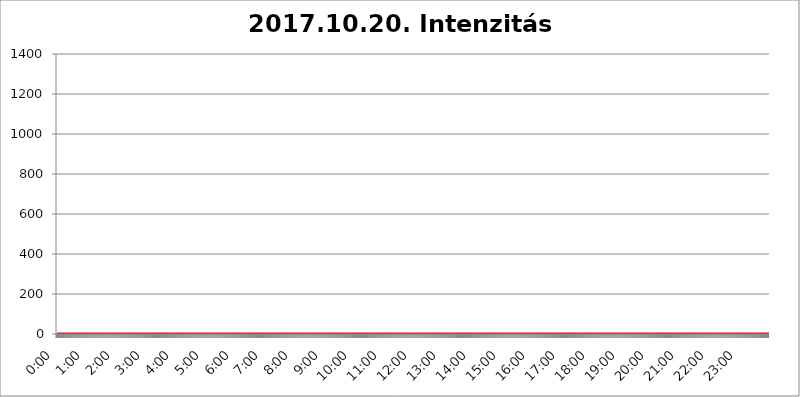
| Category | 2017.10.20. Intenzitás [W/m^2] |
|---|---|
| 0.0 | 0 |
| 0.0006944444444444445 | 0 |
| 0.001388888888888889 | 0 |
| 0.0020833333333333333 | 0 |
| 0.002777777777777778 | 0 |
| 0.003472222222222222 | 0 |
| 0.004166666666666667 | 0 |
| 0.004861111111111111 | 0 |
| 0.005555555555555556 | 0 |
| 0.0062499999999999995 | 0 |
| 0.006944444444444444 | 0 |
| 0.007638888888888889 | 0 |
| 0.008333333333333333 | 0 |
| 0.009027777777777779 | 0 |
| 0.009722222222222222 | 0 |
| 0.010416666666666666 | 0 |
| 0.011111111111111112 | 0 |
| 0.011805555555555555 | 0 |
| 0.012499999999999999 | 0 |
| 0.013194444444444444 | 0 |
| 0.013888888888888888 | 0 |
| 0.014583333333333332 | 0 |
| 0.015277777777777777 | 0 |
| 0.015972222222222224 | 0 |
| 0.016666666666666666 | 0 |
| 0.017361111111111112 | 0 |
| 0.018055555555555557 | 0 |
| 0.01875 | 0 |
| 0.019444444444444445 | 0 |
| 0.02013888888888889 | 0 |
| 0.020833333333333332 | 0 |
| 0.02152777777777778 | 0 |
| 0.022222222222222223 | 0 |
| 0.02291666666666667 | 0 |
| 0.02361111111111111 | 0 |
| 0.024305555555555556 | 0 |
| 0.024999999999999998 | 0 |
| 0.025694444444444447 | 0 |
| 0.02638888888888889 | 0 |
| 0.027083333333333334 | 0 |
| 0.027777777777777776 | 0 |
| 0.02847222222222222 | 0 |
| 0.029166666666666664 | 0 |
| 0.029861111111111113 | 0 |
| 0.030555555555555555 | 0 |
| 0.03125 | 0 |
| 0.03194444444444445 | 0 |
| 0.03263888888888889 | 0 |
| 0.03333333333333333 | 0 |
| 0.034027777777777775 | 0 |
| 0.034722222222222224 | 0 |
| 0.035416666666666666 | 0 |
| 0.036111111111111115 | 0 |
| 0.03680555555555556 | 0 |
| 0.0375 | 0 |
| 0.03819444444444444 | 0 |
| 0.03888888888888889 | 0 |
| 0.03958333333333333 | 0 |
| 0.04027777777777778 | 0 |
| 0.04097222222222222 | 0 |
| 0.041666666666666664 | 0 |
| 0.042361111111111106 | 0 |
| 0.04305555555555556 | 0 |
| 0.043750000000000004 | 0 |
| 0.044444444444444446 | 0 |
| 0.04513888888888889 | 0 |
| 0.04583333333333334 | 0 |
| 0.04652777777777778 | 0 |
| 0.04722222222222222 | 0 |
| 0.04791666666666666 | 0 |
| 0.04861111111111111 | 0 |
| 0.049305555555555554 | 0 |
| 0.049999999999999996 | 0 |
| 0.05069444444444445 | 0 |
| 0.051388888888888894 | 0 |
| 0.052083333333333336 | 0 |
| 0.05277777777777778 | 0 |
| 0.05347222222222222 | 0 |
| 0.05416666666666667 | 0 |
| 0.05486111111111111 | 0 |
| 0.05555555555555555 | 0 |
| 0.05625 | 0 |
| 0.05694444444444444 | 0 |
| 0.057638888888888885 | 0 |
| 0.05833333333333333 | 0 |
| 0.05902777777777778 | 0 |
| 0.059722222222222225 | 0 |
| 0.06041666666666667 | 0 |
| 0.061111111111111116 | 0 |
| 0.06180555555555556 | 0 |
| 0.0625 | 0 |
| 0.06319444444444444 | 0 |
| 0.06388888888888888 | 0 |
| 0.06458333333333334 | 0 |
| 0.06527777777777778 | 0 |
| 0.06597222222222222 | 0 |
| 0.06666666666666667 | 0 |
| 0.06736111111111111 | 0 |
| 0.06805555555555555 | 0 |
| 0.06874999999999999 | 0 |
| 0.06944444444444443 | 0 |
| 0.07013888888888889 | 0 |
| 0.07083333333333333 | 0 |
| 0.07152777777777779 | 0 |
| 0.07222222222222223 | 0 |
| 0.07291666666666667 | 0 |
| 0.07361111111111111 | 0 |
| 0.07430555555555556 | 0 |
| 0.075 | 0 |
| 0.07569444444444444 | 0 |
| 0.0763888888888889 | 0 |
| 0.07708333333333334 | 0 |
| 0.07777777777777778 | 0 |
| 0.07847222222222222 | 0 |
| 0.07916666666666666 | 0 |
| 0.0798611111111111 | 0 |
| 0.08055555555555556 | 0 |
| 0.08125 | 0 |
| 0.08194444444444444 | 0 |
| 0.08263888888888889 | 0 |
| 0.08333333333333333 | 0 |
| 0.08402777777777777 | 0 |
| 0.08472222222222221 | 0 |
| 0.08541666666666665 | 0 |
| 0.08611111111111112 | 0 |
| 0.08680555555555557 | 0 |
| 0.08750000000000001 | 0 |
| 0.08819444444444445 | 0 |
| 0.08888888888888889 | 0 |
| 0.08958333333333333 | 0 |
| 0.09027777777777778 | 0 |
| 0.09097222222222222 | 0 |
| 0.09166666666666667 | 0 |
| 0.09236111111111112 | 0 |
| 0.09305555555555556 | 0 |
| 0.09375 | 0 |
| 0.09444444444444444 | 0 |
| 0.09513888888888888 | 0 |
| 0.09583333333333333 | 0 |
| 0.09652777777777777 | 0 |
| 0.09722222222222222 | 0 |
| 0.09791666666666667 | 0 |
| 0.09861111111111111 | 0 |
| 0.09930555555555555 | 0 |
| 0.09999999999999999 | 0 |
| 0.10069444444444443 | 0 |
| 0.1013888888888889 | 0 |
| 0.10208333333333335 | 0 |
| 0.10277777777777779 | 0 |
| 0.10347222222222223 | 0 |
| 0.10416666666666667 | 0 |
| 0.10486111111111111 | 0 |
| 0.10555555555555556 | 0 |
| 0.10625 | 0 |
| 0.10694444444444444 | 0 |
| 0.1076388888888889 | 0 |
| 0.10833333333333334 | 0 |
| 0.10902777777777778 | 0 |
| 0.10972222222222222 | 0 |
| 0.1111111111111111 | 0 |
| 0.11180555555555556 | 0 |
| 0.11180555555555556 | 0 |
| 0.1125 | 0 |
| 0.11319444444444444 | 0 |
| 0.11388888888888889 | 0 |
| 0.11458333333333333 | 0 |
| 0.11527777777777777 | 0 |
| 0.11597222222222221 | 0 |
| 0.11666666666666665 | 0 |
| 0.1173611111111111 | 0 |
| 0.11805555555555557 | 0 |
| 0.11944444444444445 | 0 |
| 0.12013888888888889 | 0 |
| 0.12083333333333333 | 0 |
| 0.12152777777777778 | 0 |
| 0.12222222222222223 | 0 |
| 0.12291666666666667 | 0 |
| 0.12291666666666667 | 0 |
| 0.12361111111111112 | 0 |
| 0.12430555555555556 | 0 |
| 0.125 | 0 |
| 0.12569444444444444 | 0 |
| 0.12638888888888888 | 0 |
| 0.12708333333333333 | 0 |
| 0.16875 | 0 |
| 0.12847222222222224 | 0 |
| 0.12916666666666668 | 0 |
| 0.12986111111111112 | 0 |
| 0.13055555555555556 | 0 |
| 0.13125 | 0 |
| 0.13194444444444445 | 0 |
| 0.1326388888888889 | 0 |
| 0.13333333333333333 | 0 |
| 0.13402777777777777 | 0 |
| 0.13402777777777777 | 0 |
| 0.13472222222222222 | 0 |
| 0.13541666666666666 | 0 |
| 0.1361111111111111 | 0 |
| 0.13749999999999998 | 0 |
| 0.13819444444444443 | 0 |
| 0.1388888888888889 | 0 |
| 0.13958333333333334 | 0 |
| 0.14027777777777778 | 0 |
| 0.14097222222222222 | 0 |
| 0.14166666666666666 | 0 |
| 0.1423611111111111 | 0 |
| 0.14305555555555557 | 0 |
| 0.14375000000000002 | 0 |
| 0.14444444444444446 | 0 |
| 0.1451388888888889 | 0 |
| 0.1451388888888889 | 0 |
| 0.14652777777777778 | 0 |
| 0.14722222222222223 | 0 |
| 0.14791666666666667 | 0 |
| 0.1486111111111111 | 0 |
| 0.14930555555555555 | 0 |
| 0.15 | 0 |
| 0.15069444444444444 | 0 |
| 0.15138888888888888 | 0 |
| 0.15208333333333332 | 0 |
| 0.15277777777777776 | 0 |
| 0.15347222222222223 | 0 |
| 0.15416666666666667 | 0 |
| 0.15486111111111112 | 0 |
| 0.15555555555555556 | 0 |
| 0.15625 | 0 |
| 0.15694444444444444 | 0 |
| 0.15763888888888888 | 0 |
| 0.15833333333333333 | 0 |
| 0.15902777777777777 | 0 |
| 0.15972222222222224 | 0 |
| 0.16041666666666668 | 0 |
| 0.16111111111111112 | 0 |
| 0.16180555555555556 | 0 |
| 0.1625 | 0 |
| 0.16319444444444445 | 0 |
| 0.1638888888888889 | 0 |
| 0.16458333333333333 | 0 |
| 0.16527777777777777 | 0 |
| 0.16597222222222222 | 0 |
| 0.16666666666666666 | 0 |
| 0.1673611111111111 | 0 |
| 0.16805555555555554 | 0 |
| 0.16874999999999998 | 0 |
| 0.16944444444444443 | 0 |
| 0.17013888888888887 | 0 |
| 0.1708333333333333 | 0 |
| 0.17152777777777775 | 0 |
| 0.17222222222222225 | 0 |
| 0.1729166666666667 | 0 |
| 0.17361111111111113 | 0 |
| 0.17430555555555557 | 0 |
| 0.17500000000000002 | 0 |
| 0.17569444444444446 | 0 |
| 0.1763888888888889 | 0 |
| 0.17708333333333334 | 0 |
| 0.17777777777777778 | 0 |
| 0.17847222222222223 | 0 |
| 0.17916666666666667 | 0 |
| 0.1798611111111111 | 0 |
| 0.18055555555555555 | 0 |
| 0.18125 | 0 |
| 0.18194444444444444 | 0 |
| 0.1826388888888889 | 0 |
| 0.18333333333333335 | 0 |
| 0.1840277777777778 | 0 |
| 0.18472222222222223 | 0 |
| 0.18541666666666667 | 0 |
| 0.18611111111111112 | 0 |
| 0.18680555555555556 | 0 |
| 0.1875 | 0 |
| 0.18819444444444444 | 0 |
| 0.18888888888888888 | 0 |
| 0.18958333333333333 | 0 |
| 0.19027777777777777 | 0 |
| 0.1909722222222222 | 0 |
| 0.19166666666666665 | 0 |
| 0.19236111111111112 | 0 |
| 0.19305555555555554 | 0 |
| 0.19375 | 0 |
| 0.19444444444444445 | 0 |
| 0.1951388888888889 | 0 |
| 0.19583333333333333 | 0 |
| 0.19652777777777777 | 0 |
| 0.19722222222222222 | 0 |
| 0.19791666666666666 | 0 |
| 0.1986111111111111 | 0 |
| 0.19930555555555554 | 0 |
| 0.19999999999999998 | 0 |
| 0.20069444444444443 | 0 |
| 0.20138888888888887 | 0 |
| 0.2020833333333333 | 0 |
| 0.2027777777777778 | 0 |
| 0.2034722222222222 | 0 |
| 0.2041666666666667 | 0 |
| 0.20486111111111113 | 0 |
| 0.20555555555555557 | 0 |
| 0.20625000000000002 | 0 |
| 0.20694444444444446 | 0 |
| 0.2076388888888889 | 0 |
| 0.20833333333333334 | 0 |
| 0.20902777777777778 | 0 |
| 0.20972222222222223 | 0 |
| 0.21041666666666667 | 0 |
| 0.2111111111111111 | 0 |
| 0.21180555555555555 | 0 |
| 0.2125 | 0 |
| 0.21319444444444444 | 0 |
| 0.2138888888888889 | 0 |
| 0.21458333333333335 | 0 |
| 0.2152777777777778 | 0 |
| 0.21597222222222223 | 0 |
| 0.21666666666666667 | 0 |
| 0.21736111111111112 | 0 |
| 0.21805555555555556 | 0 |
| 0.21875 | 0 |
| 0.21944444444444444 | 0 |
| 0.22013888888888888 | 0 |
| 0.22083333333333333 | 0 |
| 0.22152777777777777 | 0 |
| 0.2222222222222222 | 0 |
| 0.22291666666666665 | 0 |
| 0.2236111111111111 | 0 |
| 0.22430555555555556 | 0 |
| 0.225 | 0 |
| 0.22569444444444445 | 0 |
| 0.2263888888888889 | 0 |
| 0.22708333333333333 | 0 |
| 0.22777777777777777 | 0 |
| 0.22847222222222222 | 0 |
| 0.22916666666666666 | 0 |
| 0.2298611111111111 | 0 |
| 0.23055555555555554 | 0 |
| 0.23124999999999998 | 0 |
| 0.23194444444444443 | 0 |
| 0.23263888888888887 | 0 |
| 0.2333333333333333 | 0 |
| 0.2340277777777778 | 0 |
| 0.2347222222222222 | 0 |
| 0.2354166666666667 | 0 |
| 0.23611111111111113 | 0 |
| 0.23680555555555557 | 0 |
| 0.23750000000000002 | 0 |
| 0.23819444444444446 | 0 |
| 0.2388888888888889 | 0 |
| 0.23958333333333334 | 0 |
| 0.24027777777777778 | 0 |
| 0.24097222222222223 | 0 |
| 0.24166666666666667 | 0 |
| 0.2423611111111111 | 0 |
| 0.24305555555555555 | 0 |
| 0.24375 | 0 |
| 0.24444444444444446 | 0 |
| 0.24513888888888888 | 0 |
| 0.24583333333333335 | 0 |
| 0.2465277777777778 | 0 |
| 0.24722222222222223 | 0 |
| 0.24791666666666667 | 0 |
| 0.24861111111111112 | 0 |
| 0.24930555555555556 | 0 |
| 0.25 | 0 |
| 0.25069444444444444 | 0 |
| 0.2513888888888889 | 0 |
| 0.2520833333333333 | 0 |
| 0.25277777777777777 | 0 |
| 0.2534722222222222 | 0 |
| 0.25416666666666665 | 0 |
| 0.2548611111111111 | 0 |
| 0.2555555555555556 | 0 |
| 0.25625000000000003 | 0 |
| 0.2569444444444445 | 0 |
| 0.2576388888888889 | 0 |
| 0.25833333333333336 | 0 |
| 0.2590277777777778 | 0 |
| 0.25972222222222224 | 0 |
| 0.2604166666666667 | 0 |
| 0.2611111111111111 | 0 |
| 0.26180555555555557 | 0 |
| 0.2625 | 0 |
| 0.26319444444444445 | 0 |
| 0.2638888888888889 | 0 |
| 0.26458333333333334 | 0 |
| 0.2652777777777778 | 0 |
| 0.2659722222222222 | 0 |
| 0.26666666666666666 | 0 |
| 0.2673611111111111 | 0 |
| 0.26805555555555555 | 0 |
| 0.26875 | 0 |
| 0.26944444444444443 | 0 |
| 0.2701388888888889 | 0 |
| 0.2708333333333333 | 0 |
| 0.27152777777777776 | 0 |
| 0.2722222222222222 | 0 |
| 0.27291666666666664 | 0 |
| 0.2736111111111111 | 0 |
| 0.2743055555555555 | 0 |
| 0.27499999999999997 | 0 |
| 0.27569444444444446 | 0 |
| 0.27638888888888885 | 0 |
| 0.27708333333333335 | 0 |
| 0.2777777777777778 | 0 |
| 0.27847222222222223 | 0 |
| 0.2791666666666667 | 0 |
| 0.2798611111111111 | 0 |
| 0.28055555555555556 | 0 |
| 0.28125 | 0 |
| 0.28194444444444444 | 0 |
| 0.2826388888888889 | 0 |
| 0.2833333333333333 | 0 |
| 0.28402777777777777 | 0 |
| 0.2847222222222222 | 0 |
| 0.28541666666666665 | 0 |
| 0.28611111111111115 | 0 |
| 0.28680555555555554 | 0 |
| 0.28750000000000003 | 0 |
| 0.2881944444444445 | 0 |
| 0.2888888888888889 | 0 |
| 0.28958333333333336 | 0 |
| 0.2902777777777778 | 0 |
| 0.29097222222222224 | 0 |
| 0.2916666666666667 | 0 |
| 0.2923611111111111 | 0 |
| 0.29305555555555557 | 0 |
| 0.29375 | 0 |
| 0.29444444444444445 | 0 |
| 0.2951388888888889 | 0 |
| 0.29583333333333334 | 0 |
| 0.2965277777777778 | 0 |
| 0.2972222222222222 | 0 |
| 0.29791666666666666 | 0 |
| 0.2986111111111111 | 0 |
| 0.29930555555555555 | 0 |
| 0.3 | 0 |
| 0.30069444444444443 | 0 |
| 0.3013888888888889 | 0 |
| 0.3020833333333333 | 0 |
| 0.30277777777777776 | 0 |
| 0.3034722222222222 | 0 |
| 0.30416666666666664 | 0 |
| 0.3048611111111111 | 0 |
| 0.3055555555555555 | 0 |
| 0.30624999999999997 | 0 |
| 0.3069444444444444 | 0 |
| 0.3076388888888889 | 0 |
| 0.30833333333333335 | 0 |
| 0.3090277777777778 | 0 |
| 0.30972222222222223 | 0 |
| 0.3104166666666667 | 0 |
| 0.3111111111111111 | 0 |
| 0.31180555555555556 | 0 |
| 0.3125 | 0 |
| 0.31319444444444444 | 0 |
| 0.3138888888888889 | 0 |
| 0.3145833333333333 | 0 |
| 0.31527777777777777 | 0 |
| 0.3159722222222222 | 0 |
| 0.31666666666666665 | 0 |
| 0.31736111111111115 | 0 |
| 0.31805555555555554 | 0 |
| 0.31875000000000003 | 0 |
| 0.3194444444444445 | 0 |
| 0.3201388888888889 | 0 |
| 0.32083333333333336 | 0 |
| 0.3215277777777778 | 0 |
| 0.32222222222222224 | 0 |
| 0.3229166666666667 | 0 |
| 0.3236111111111111 | 0 |
| 0.32430555555555557 | 0 |
| 0.325 | 0 |
| 0.32569444444444445 | 0 |
| 0.3263888888888889 | 0 |
| 0.32708333333333334 | 0 |
| 0.3277777777777778 | 0 |
| 0.3284722222222222 | 0 |
| 0.32916666666666666 | 0 |
| 0.3298611111111111 | 0 |
| 0.33055555555555555 | 0 |
| 0.33125 | 0 |
| 0.33194444444444443 | 0 |
| 0.3326388888888889 | 0 |
| 0.3333333333333333 | 0 |
| 0.3340277777777778 | 0 |
| 0.3347222222222222 | 0 |
| 0.3354166666666667 | 0 |
| 0.3361111111111111 | 0 |
| 0.3368055555555556 | 0 |
| 0.33749999999999997 | 0 |
| 0.33819444444444446 | 0 |
| 0.33888888888888885 | 0 |
| 0.33958333333333335 | 0 |
| 0.34027777777777773 | 0 |
| 0.34097222222222223 | 0 |
| 0.3416666666666666 | 0 |
| 0.3423611111111111 | 0 |
| 0.3430555555555555 | 0 |
| 0.34375 | 0 |
| 0.3444444444444445 | 0 |
| 0.3451388888888889 | 0 |
| 0.3458333333333334 | 0 |
| 0.34652777777777777 | 0 |
| 0.34722222222222227 | 0 |
| 0.34791666666666665 | 0 |
| 0.34861111111111115 | 0 |
| 0.34930555555555554 | 0 |
| 0.35000000000000003 | 0 |
| 0.3506944444444444 | 0 |
| 0.3513888888888889 | 0 |
| 0.3520833333333333 | 0 |
| 0.3527777777777778 | 0 |
| 0.3534722222222222 | 0 |
| 0.3541666666666667 | 0 |
| 0.3548611111111111 | 0 |
| 0.35555555555555557 | 0 |
| 0.35625 | 0 |
| 0.35694444444444445 | 0 |
| 0.3576388888888889 | 0 |
| 0.35833333333333334 | 0 |
| 0.3590277777777778 | 0 |
| 0.3597222222222222 | 0 |
| 0.36041666666666666 | 0 |
| 0.3611111111111111 | 0 |
| 0.36180555555555555 | 0 |
| 0.3625 | 0 |
| 0.36319444444444443 | 0 |
| 0.3638888888888889 | 0 |
| 0.3645833333333333 | 0 |
| 0.3652777777777778 | 0 |
| 0.3659722222222222 | 0 |
| 0.3666666666666667 | 0 |
| 0.3673611111111111 | 0 |
| 0.3680555555555556 | 0 |
| 0.36874999999999997 | 0 |
| 0.36944444444444446 | 0 |
| 0.37013888888888885 | 0 |
| 0.37083333333333335 | 0 |
| 0.37152777777777773 | 0 |
| 0.37222222222222223 | 0 |
| 0.3729166666666666 | 0 |
| 0.3736111111111111 | 0 |
| 0.3743055555555555 | 0 |
| 0.375 | 0 |
| 0.3756944444444445 | 0 |
| 0.3763888888888889 | 0 |
| 0.3770833333333334 | 0 |
| 0.37777777777777777 | 0 |
| 0.37847222222222227 | 0 |
| 0.37916666666666665 | 0 |
| 0.37986111111111115 | 0 |
| 0.38055555555555554 | 0 |
| 0.38125000000000003 | 0 |
| 0.3819444444444444 | 0 |
| 0.3826388888888889 | 0 |
| 0.3833333333333333 | 0 |
| 0.3840277777777778 | 0 |
| 0.3847222222222222 | 0 |
| 0.3854166666666667 | 0 |
| 0.3861111111111111 | 0 |
| 0.38680555555555557 | 0 |
| 0.3875 | 0 |
| 0.38819444444444445 | 0 |
| 0.3888888888888889 | 0 |
| 0.38958333333333334 | 0 |
| 0.3902777777777778 | 0 |
| 0.3909722222222222 | 0 |
| 0.39166666666666666 | 0 |
| 0.3923611111111111 | 0 |
| 0.39305555555555555 | 0 |
| 0.39375 | 0 |
| 0.39444444444444443 | 0 |
| 0.3951388888888889 | 0 |
| 0.3958333333333333 | 0 |
| 0.3965277777777778 | 0 |
| 0.3972222222222222 | 0 |
| 0.3979166666666667 | 0 |
| 0.3986111111111111 | 0 |
| 0.3993055555555556 | 0 |
| 0.39999999999999997 | 0 |
| 0.40069444444444446 | 0 |
| 0.40138888888888885 | 0 |
| 0.40208333333333335 | 0 |
| 0.40277777777777773 | 0 |
| 0.40347222222222223 | 0 |
| 0.4041666666666666 | 0 |
| 0.4048611111111111 | 0 |
| 0.4055555555555555 | 0 |
| 0.40625 | 0 |
| 0.4069444444444445 | 0 |
| 0.4076388888888889 | 0 |
| 0.4083333333333334 | 0 |
| 0.40902777777777777 | 0 |
| 0.40972222222222227 | 0 |
| 0.41041666666666665 | 0 |
| 0.41111111111111115 | 0 |
| 0.41180555555555554 | 0 |
| 0.41250000000000003 | 0 |
| 0.4131944444444444 | 0 |
| 0.4138888888888889 | 0 |
| 0.4145833333333333 | 0 |
| 0.4152777777777778 | 0 |
| 0.4159722222222222 | 0 |
| 0.4166666666666667 | 0 |
| 0.4173611111111111 | 0 |
| 0.41805555555555557 | 0 |
| 0.41875 | 0 |
| 0.41944444444444445 | 0 |
| 0.4201388888888889 | 0 |
| 0.42083333333333334 | 0 |
| 0.4215277777777778 | 0 |
| 0.4222222222222222 | 0 |
| 0.42291666666666666 | 0 |
| 0.4236111111111111 | 0 |
| 0.42430555555555555 | 0 |
| 0.425 | 0 |
| 0.42569444444444443 | 0 |
| 0.4263888888888889 | 0 |
| 0.4270833333333333 | 0 |
| 0.4277777777777778 | 0 |
| 0.4284722222222222 | 0 |
| 0.4291666666666667 | 0 |
| 0.4298611111111111 | 0 |
| 0.4305555555555556 | 0 |
| 0.43124999999999997 | 0 |
| 0.43194444444444446 | 0 |
| 0.43263888888888885 | 0 |
| 0.43333333333333335 | 0 |
| 0.43402777777777773 | 0 |
| 0.43472222222222223 | 0 |
| 0.4354166666666666 | 0 |
| 0.4361111111111111 | 0 |
| 0.4368055555555555 | 0 |
| 0.4375 | 0 |
| 0.4381944444444445 | 0 |
| 0.4388888888888889 | 0 |
| 0.4395833333333334 | 0 |
| 0.44027777777777777 | 0 |
| 0.44097222222222227 | 0 |
| 0.44166666666666665 | 0 |
| 0.44236111111111115 | 0 |
| 0.44305555555555554 | 0 |
| 0.44375000000000003 | 0 |
| 0.4444444444444444 | 0 |
| 0.4451388888888889 | 0 |
| 0.4458333333333333 | 0 |
| 0.4465277777777778 | 0 |
| 0.4472222222222222 | 0 |
| 0.4479166666666667 | 0 |
| 0.4486111111111111 | 0 |
| 0.44930555555555557 | 0 |
| 0.45 | 0 |
| 0.45069444444444445 | 0 |
| 0.4513888888888889 | 0 |
| 0.45208333333333334 | 0 |
| 0.4527777777777778 | 0 |
| 0.4534722222222222 | 0 |
| 0.45416666666666666 | 0 |
| 0.4548611111111111 | 0 |
| 0.45555555555555555 | 0 |
| 0.45625 | 0 |
| 0.45694444444444443 | 0 |
| 0.4576388888888889 | 0 |
| 0.4583333333333333 | 0 |
| 0.4590277777777778 | 0 |
| 0.4597222222222222 | 0 |
| 0.4604166666666667 | 0 |
| 0.4611111111111111 | 0 |
| 0.4618055555555556 | 0 |
| 0.46249999999999997 | 0 |
| 0.46319444444444446 | 0 |
| 0.46388888888888885 | 0 |
| 0.46458333333333335 | 0 |
| 0.46527777777777773 | 0 |
| 0.46597222222222223 | 0 |
| 0.4666666666666666 | 0 |
| 0.4673611111111111 | 0 |
| 0.4680555555555555 | 0 |
| 0.46875 | 0 |
| 0.4694444444444445 | 0 |
| 0.4701388888888889 | 0 |
| 0.4708333333333334 | 0 |
| 0.47152777777777777 | 0 |
| 0.47222222222222227 | 0 |
| 0.47291666666666665 | 0 |
| 0.47361111111111115 | 0 |
| 0.47430555555555554 | 0 |
| 0.47500000000000003 | 0 |
| 0.4756944444444444 | 0 |
| 0.4763888888888889 | 0 |
| 0.4770833333333333 | 0 |
| 0.4777777777777778 | 0 |
| 0.4784722222222222 | 0 |
| 0.4791666666666667 | 0 |
| 0.4798611111111111 | 0 |
| 0.48055555555555557 | 0 |
| 0.48125 | 0 |
| 0.48194444444444445 | 0 |
| 0.4826388888888889 | 0 |
| 0.48333333333333334 | 0 |
| 0.4840277777777778 | 0 |
| 0.4847222222222222 | 0 |
| 0.48541666666666666 | 0 |
| 0.4861111111111111 | 0 |
| 0.48680555555555555 | 0 |
| 0.4875 | 0 |
| 0.48819444444444443 | 0 |
| 0.4888888888888889 | 0 |
| 0.4895833333333333 | 0 |
| 0.4902777777777778 | 0 |
| 0.4909722222222222 | 0 |
| 0.4916666666666667 | 0 |
| 0.4923611111111111 | 0 |
| 0.4930555555555556 | 0 |
| 0.49374999999999997 | 0 |
| 0.49444444444444446 | 0 |
| 0.49513888888888885 | 0 |
| 0.49583333333333335 | 0 |
| 0.49652777777777773 | 0 |
| 0.49722222222222223 | 0 |
| 0.4979166666666666 | 0 |
| 0.4986111111111111 | 0 |
| 0.4993055555555555 | 0 |
| 0.5 | 0 |
| 0.5006944444444444 | 0 |
| 0.5013888888888889 | 0 |
| 0.5020833333333333 | 0 |
| 0.5027777777777778 | 0 |
| 0.5034722222222222 | 0 |
| 0.5041666666666667 | 0 |
| 0.5048611111111111 | 0 |
| 0.5055555555555555 | 0 |
| 0.50625 | 0 |
| 0.5069444444444444 | 0 |
| 0.5076388888888889 | 0 |
| 0.5083333333333333 | 0 |
| 0.5090277777777777 | 0 |
| 0.5097222222222222 | 0 |
| 0.5104166666666666 | 0 |
| 0.5111111111111112 | 0 |
| 0.5118055555555555 | 0 |
| 0.5125000000000001 | 0 |
| 0.5131944444444444 | 0 |
| 0.513888888888889 | 0 |
| 0.5145833333333333 | 0 |
| 0.5152777777777778 | 0 |
| 0.5159722222222222 | 0 |
| 0.5166666666666667 | 0 |
| 0.517361111111111 | 0 |
| 0.5180555555555556 | 0 |
| 0.5187499999999999 | 0 |
| 0.5194444444444445 | 0 |
| 0.5201388888888888 | 0 |
| 0.5208333333333334 | 0 |
| 0.5215277777777778 | 0 |
| 0.5222222222222223 | 0 |
| 0.5229166666666667 | 0 |
| 0.5236111111111111 | 0 |
| 0.5243055555555556 | 0 |
| 0.525 | 0 |
| 0.5256944444444445 | 0 |
| 0.5263888888888889 | 0 |
| 0.5270833333333333 | 0 |
| 0.5277777777777778 | 0 |
| 0.5284722222222222 | 0 |
| 0.5291666666666667 | 0 |
| 0.5298611111111111 | 0 |
| 0.5305555555555556 | 0 |
| 0.53125 | 0 |
| 0.5319444444444444 | 0 |
| 0.5326388888888889 | 0 |
| 0.5333333333333333 | 0 |
| 0.5340277777777778 | 0 |
| 0.5347222222222222 | 0 |
| 0.5354166666666667 | 0 |
| 0.5361111111111111 | 0 |
| 0.5368055555555555 | 0 |
| 0.5375 | 0 |
| 0.5381944444444444 | 0 |
| 0.5388888888888889 | 0 |
| 0.5395833333333333 | 0 |
| 0.5402777777777777 | 0 |
| 0.5409722222222222 | 0 |
| 0.5416666666666666 | 0 |
| 0.5423611111111112 | 0 |
| 0.5430555555555555 | 0 |
| 0.5437500000000001 | 0 |
| 0.5444444444444444 | 0 |
| 0.545138888888889 | 0 |
| 0.5458333333333333 | 0 |
| 0.5465277777777778 | 0 |
| 0.5472222222222222 | 0 |
| 0.5479166666666667 | 0 |
| 0.548611111111111 | 0 |
| 0.5493055555555556 | 0 |
| 0.5499999999999999 | 0 |
| 0.5506944444444445 | 0 |
| 0.5513888888888888 | 0 |
| 0.5520833333333334 | 0 |
| 0.5527777777777778 | 0 |
| 0.5534722222222223 | 0 |
| 0.5541666666666667 | 0 |
| 0.5548611111111111 | 0 |
| 0.5555555555555556 | 0 |
| 0.55625 | 0 |
| 0.5569444444444445 | 0 |
| 0.5576388888888889 | 0 |
| 0.5583333333333333 | 0 |
| 0.5590277777777778 | 0 |
| 0.5597222222222222 | 0 |
| 0.5604166666666667 | 0 |
| 0.5611111111111111 | 0 |
| 0.5618055555555556 | 0 |
| 0.5625 | 0 |
| 0.5631944444444444 | 0 |
| 0.5638888888888889 | 0 |
| 0.5645833333333333 | 0 |
| 0.5652777777777778 | 0 |
| 0.5659722222222222 | 0 |
| 0.5666666666666667 | 0 |
| 0.5673611111111111 | 0 |
| 0.5680555555555555 | 0 |
| 0.56875 | 0 |
| 0.5694444444444444 | 0 |
| 0.5701388888888889 | 0 |
| 0.5708333333333333 | 0 |
| 0.5715277777777777 | 0 |
| 0.5722222222222222 | 0 |
| 0.5729166666666666 | 0 |
| 0.5736111111111112 | 0 |
| 0.5743055555555555 | 0 |
| 0.5750000000000001 | 0 |
| 0.5756944444444444 | 0 |
| 0.576388888888889 | 0 |
| 0.5770833333333333 | 0 |
| 0.5777777777777778 | 0 |
| 0.5784722222222222 | 0 |
| 0.5791666666666667 | 0 |
| 0.579861111111111 | 0 |
| 0.5805555555555556 | 0 |
| 0.5812499999999999 | 0 |
| 0.5819444444444445 | 0 |
| 0.5826388888888888 | 0 |
| 0.5833333333333334 | 0 |
| 0.5840277777777778 | 0 |
| 0.5847222222222223 | 0 |
| 0.5854166666666667 | 0 |
| 0.5861111111111111 | 0 |
| 0.5868055555555556 | 0 |
| 0.5875 | 0 |
| 0.5881944444444445 | 0 |
| 0.5888888888888889 | 0 |
| 0.5895833333333333 | 0 |
| 0.5902777777777778 | 0 |
| 0.5909722222222222 | 0 |
| 0.5916666666666667 | 0 |
| 0.5923611111111111 | 0 |
| 0.5930555555555556 | 0 |
| 0.59375 | 0 |
| 0.5944444444444444 | 0 |
| 0.5951388888888889 | 0 |
| 0.5958333333333333 | 0 |
| 0.5965277777777778 | 0 |
| 0.5972222222222222 | 0 |
| 0.5979166666666667 | 0 |
| 0.5986111111111111 | 0 |
| 0.5993055555555555 | 0 |
| 0.6 | 0 |
| 0.6006944444444444 | 0 |
| 0.6013888888888889 | 0 |
| 0.6020833333333333 | 0 |
| 0.6027777777777777 | 0 |
| 0.6034722222222222 | 0 |
| 0.6041666666666666 | 0 |
| 0.6048611111111112 | 0 |
| 0.6055555555555555 | 0 |
| 0.6062500000000001 | 0 |
| 0.6069444444444444 | 0 |
| 0.607638888888889 | 0 |
| 0.6083333333333333 | 0 |
| 0.6090277777777778 | 0 |
| 0.6097222222222222 | 0 |
| 0.6104166666666667 | 0 |
| 0.611111111111111 | 0 |
| 0.6118055555555556 | 0 |
| 0.6124999999999999 | 0 |
| 0.6131944444444445 | 0 |
| 0.6138888888888888 | 0 |
| 0.6145833333333334 | 0 |
| 0.6152777777777778 | 0 |
| 0.6159722222222223 | 0 |
| 0.6166666666666667 | 0 |
| 0.6173611111111111 | 0 |
| 0.6180555555555556 | 0 |
| 0.61875 | 0 |
| 0.6194444444444445 | 0 |
| 0.6201388888888889 | 0 |
| 0.6208333333333333 | 0 |
| 0.6215277777777778 | 0 |
| 0.6222222222222222 | 0 |
| 0.6229166666666667 | 0 |
| 0.6236111111111111 | 0 |
| 0.6243055555555556 | 0 |
| 0.625 | 0 |
| 0.6256944444444444 | 0 |
| 0.6263888888888889 | 0 |
| 0.6270833333333333 | 0 |
| 0.6277777777777778 | 0 |
| 0.6284722222222222 | 0 |
| 0.6291666666666667 | 0 |
| 0.6298611111111111 | 0 |
| 0.6305555555555555 | 0 |
| 0.63125 | 0 |
| 0.6319444444444444 | 0 |
| 0.6326388888888889 | 0 |
| 0.6333333333333333 | 0 |
| 0.6340277777777777 | 0 |
| 0.6347222222222222 | 0 |
| 0.6354166666666666 | 0 |
| 0.6361111111111112 | 0 |
| 0.6368055555555555 | 0 |
| 0.6375000000000001 | 0 |
| 0.6381944444444444 | 0 |
| 0.638888888888889 | 0 |
| 0.6395833333333333 | 0 |
| 0.6402777777777778 | 0 |
| 0.6409722222222222 | 0 |
| 0.6416666666666667 | 0 |
| 0.642361111111111 | 0 |
| 0.6430555555555556 | 0 |
| 0.6437499999999999 | 0 |
| 0.6444444444444445 | 0 |
| 0.6451388888888888 | 0 |
| 0.6458333333333334 | 0 |
| 0.6465277777777778 | 0 |
| 0.6472222222222223 | 0 |
| 0.6479166666666667 | 0 |
| 0.6486111111111111 | 0 |
| 0.6493055555555556 | 0 |
| 0.65 | 0 |
| 0.6506944444444445 | 0 |
| 0.6513888888888889 | 0 |
| 0.6520833333333333 | 0 |
| 0.6527777777777778 | 0 |
| 0.6534722222222222 | 0 |
| 0.6541666666666667 | 0 |
| 0.6548611111111111 | 0 |
| 0.6555555555555556 | 0 |
| 0.65625 | 0 |
| 0.6569444444444444 | 0 |
| 0.6576388888888889 | 0 |
| 0.6583333333333333 | 0 |
| 0.6590277777777778 | 0 |
| 0.6597222222222222 | 0 |
| 0.6604166666666667 | 0 |
| 0.6611111111111111 | 0 |
| 0.6618055555555555 | 0 |
| 0.6625 | 0 |
| 0.6631944444444444 | 0 |
| 0.6638888888888889 | 0 |
| 0.6645833333333333 | 0 |
| 0.6652777777777777 | 0 |
| 0.6659722222222222 | 0 |
| 0.6666666666666666 | 0 |
| 0.6673611111111111 | 0 |
| 0.6680555555555556 | 0 |
| 0.6687500000000001 | 0 |
| 0.6694444444444444 | 0 |
| 0.6701388888888888 | 0 |
| 0.6708333333333334 | 0 |
| 0.6715277777777778 | 0 |
| 0.6722222222222222 | 0 |
| 0.6729166666666666 | 0 |
| 0.6736111111111112 | 0 |
| 0.6743055555555556 | 0 |
| 0.6749999999999999 | 0 |
| 0.6756944444444444 | 0 |
| 0.6763888888888889 | 0 |
| 0.6770833333333334 | 0 |
| 0.6777777777777777 | 0 |
| 0.6784722222222223 | 0 |
| 0.6791666666666667 | 0 |
| 0.6798611111111111 | 0 |
| 0.6805555555555555 | 0 |
| 0.68125 | 0 |
| 0.6819444444444445 | 0 |
| 0.6826388888888889 | 0 |
| 0.6833333333333332 | 0 |
| 0.6840277777777778 | 0 |
| 0.6847222222222222 | 0 |
| 0.6854166666666667 | 0 |
| 0.686111111111111 | 0 |
| 0.6868055555555556 | 0 |
| 0.6875 | 0 |
| 0.6881944444444444 | 0 |
| 0.688888888888889 | 0 |
| 0.6895833333333333 | 0 |
| 0.6902777777777778 | 0 |
| 0.6909722222222222 | 0 |
| 0.6916666666666668 | 0 |
| 0.6923611111111111 | 0 |
| 0.6930555555555555 | 0 |
| 0.69375 | 0 |
| 0.6944444444444445 | 0 |
| 0.6951388888888889 | 0 |
| 0.6958333333333333 | 0 |
| 0.6965277777777777 | 0 |
| 0.6972222222222223 | 0 |
| 0.6979166666666666 | 0 |
| 0.6986111111111111 | 0 |
| 0.6993055555555556 | 0 |
| 0.7000000000000001 | 0 |
| 0.7006944444444444 | 0 |
| 0.7013888888888888 | 0 |
| 0.7020833333333334 | 0 |
| 0.7027777777777778 | 0 |
| 0.7034722222222222 | 0 |
| 0.7041666666666666 | 0 |
| 0.7048611111111112 | 0 |
| 0.7055555555555556 | 0 |
| 0.7062499999999999 | 0 |
| 0.7069444444444444 | 0 |
| 0.7076388888888889 | 0 |
| 0.7083333333333334 | 0 |
| 0.7090277777777777 | 0 |
| 0.7097222222222223 | 0 |
| 0.7104166666666667 | 0 |
| 0.7111111111111111 | 0 |
| 0.7118055555555555 | 0 |
| 0.7125 | 0 |
| 0.7131944444444445 | 0 |
| 0.7138888888888889 | 0 |
| 0.7145833333333332 | 0 |
| 0.7152777777777778 | 0 |
| 0.7159722222222222 | 0 |
| 0.7166666666666667 | 0 |
| 0.717361111111111 | 0 |
| 0.7180555555555556 | 0 |
| 0.71875 | 0 |
| 0.7194444444444444 | 0 |
| 0.720138888888889 | 0 |
| 0.7208333333333333 | 0 |
| 0.7215277777777778 | 0 |
| 0.7222222222222222 | 0 |
| 0.7229166666666668 | 0 |
| 0.7236111111111111 | 0 |
| 0.7243055555555555 | 0 |
| 0.725 | 0 |
| 0.7256944444444445 | 0 |
| 0.7263888888888889 | 0 |
| 0.7270833333333333 | 0 |
| 0.7277777777777777 | 0 |
| 0.7284722222222223 | 0 |
| 0.7291666666666666 | 0 |
| 0.7298611111111111 | 0 |
| 0.7305555555555556 | 0 |
| 0.7312500000000001 | 0 |
| 0.7319444444444444 | 0 |
| 0.7326388888888888 | 0 |
| 0.7333333333333334 | 0 |
| 0.7340277777777778 | 0 |
| 0.7347222222222222 | 0 |
| 0.7354166666666666 | 0 |
| 0.7361111111111112 | 0 |
| 0.7368055555555556 | 0 |
| 0.7374999999999999 | 0 |
| 0.7381944444444444 | 0 |
| 0.7388888888888889 | 0 |
| 0.7395833333333334 | 0 |
| 0.7402777777777777 | 0 |
| 0.7409722222222223 | 0 |
| 0.7416666666666667 | 0 |
| 0.7423611111111111 | 0 |
| 0.7430555555555555 | 0 |
| 0.74375 | 0 |
| 0.7444444444444445 | 0 |
| 0.7451388888888889 | 0 |
| 0.7458333333333332 | 0 |
| 0.7465277777777778 | 0 |
| 0.7472222222222222 | 0 |
| 0.7479166666666667 | 0 |
| 0.748611111111111 | 0 |
| 0.7493055555555556 | 0 |
| 0.75 | 0 |
| 0.7506944444444444 | 0 |
| 0.751388888888889 | 0 |
| 0.7520833333333333 | 0 |
| 0.7527777777777778 | 0 |
| 0.7534722222222222 | 0 |
| 0.7541666666666668 | 0 |
| 0.7548611111111111 | 0 |
| 0.7555555555555555 | 0 |
| 0.75625 | 0 |
| 0.7569444444444445 | 0 |
| 0.7576388888888889 | 0 |
| 0.7583333333333333 | 0 |
| 0.7590277777777777 | 0 |
| 0.7597222222222223 | 0 |
| 0.7604166666666666 | 0 |
| 0.7611111111111111 | 0 |
| 0.7618055555555556 | 0 |
| 0.7625000000000001 | 0 |
| 0.7631944444444444 | 0 |
| 0.7638888888888888 | 0 |
| 0.7645833333333334 | 0 |
| 0.7652777777777778 | 0 |
| 0.7659722222222222 | 0 |
| 0.7666666666666666 | 0 |
| 0.7673611111111112 | 0 |
| 0.7680555555555556 | 0 |
| 0.7687499999999999 | 0 |
| 0.7694444444444444 | 0 |
| 0.7701388888888889 | 0 |
| 0.7708333333333334 | 0 |
| 0.7715277777777777 | 0 |
| 0.7722222222222223 | 0 |
| 0.7729166666666667 | 0 |
| 0.7736111111111111 | 0 |
| 0.7743055555555555 | 0 |
| 0.775 | 0 |
| 0.7756944444444445 | 0 |
| 0.7763888888888889 | 0 |
| 0.7770833333333332 | 0 |
| 0.7777777777777778 | 0 |
| 0.7784722222222222 | 0 |
| 0.7791666666666667 | 0 |
| 0.779861111111111 | 0 |
| 0.7805555555555556 | 0 |
| 0.78125 | 0 |
| 0.7819444444444444 | 0 |
| 0.782638888888889 | 0 |
| 0.7833333333333333 | 0 |
| 0.7840277777777778 | 0 |
| 0.7847222222222222 | 0 |
| 0.7854166666666668 | 0 |
| 0.7861111111111111 | 0 |
| 0.7868055555555555 | 0 |
| 0.7875 | 0 |
| 0.7881944444444445 | 0 |
| 0.7888888888888889 | 0 |
| 0.7895833333333333 | 0 |
| 0.7902777777777777 | 0 |
| 0.7909722222222223 | 0 |
| 0.7916666666666666 | 0 |
| 0.7923611111111111 | 0 |
| 0.7930555555555556 | 0 |
| 0.7937500000000001 | 0 |
| 0.7944444444444444 | 0 |
| 0.7951388888888888 | 0 |
| 0.7958333333333334 | 0 |
| 0.7965277777777778 | 0 |
| 0.7972222222222222 | 0 |
| 0.7979166666666666 | 0 |
| 0.7986111111111112 | 0 |
| 0.7993055555555556 | 0 |
| 0.7999999999999999 | 0 |
| 0.8006944444444444 | 0 |
| 0.8013888888888889 | 0 |
| 0.8020833333333334 | 0 |
| 0.8027777777777777 | 0 |
| 0.8034722222222223 | 0 |
| 0.8041666666666667 | 0 |
| 0.8048611111111111 | 0 |
| 0.8055555555555555 | 0 |
| 0.80625 | 0 |
| 0.8069444444444445 | 0 |
| 0.8076388888888889 | 0 |
| 0.8083333333333332 | 0 |
| 0.8090277777777778 | 0 |
| 0.8097222222222222 | 0 |
| 0.8104166666666667 | 0 |
| 0.811111111111111 | 0 |
| 0.8118055555555556 | 0 |
| 0.8125 | 0 |
| 0.8131944444444444 | 0 |
| 0.813888888888889 | 0 |
| 0.8145833333333333 | 0 |
| 0.8152777777777778 | 0 |
| 0.8159722222222222 | 0 |
| 0.8166666666666668 | 0 |
| 0.8173611111111111 | 0 |
| 0.8180555555555555 | 0 |
| 0.81875 | 0 |
| 0.8194444444444445 | 0 |
| 0.8201388888888889 | 0 |
| 0.8208333333333333 | 0 |
| 0.8215277777777777 | 0 |
| 0.8222222222222223 | 0 |
| 0.8229166666666666 | 0 |
| 0.8236111111111111 | 0 |
| 0.8243055555555556 | 0 |
| 0.8250000000000001 | 0 |
| 0.8256944444444444 | 0 |
| 0.8263888888888888 | 0 |
| 0.8270833333333334 | 0 |
| 0.8277777777777778 | 0 |
| 0.8284722222222222 | 0 |
| 0.8291666666666666 | 0 |
| 0.8298611111111112 | 0 |
| 0.8305555555555556 | 0 |
| 0.8312499999999999 | 0 |
| 0.8319444444444444 | 0 |
| 0.8326388888888889 | 0 |
| 0.8333333333333334 | 0 |
| 0.8340277777777777 | 0 |
| 0.8347222222222223 | 0 |
| 0.8354166666666667 | 0 |
| 0.8361111111111111 | 0 |
| 0.8368055555555555 | 0 |
| 0.8375 | 0 |
| 0.8381944444444445 | 0 |
| 0.8388888888888889 | 0 |
| 0.8395833333333332 | 0 |
| 0.8402777777777778 | 0 |
| 0.8409722222222222 | 0 |
| 0.8416666666666667 | 0 |
| 0.842361111111111 | 0 |
| 0.8430555555555556 | 0 |
| 0.84375 | 0 |
| 0.8444444444444444 | 0 |
| 0.845138888888889 | 0 |
| 0.8458333333333333 | 0 |
| 0.8465277777777778 | 0 |
| 0.8472222222222222 | 0 |
| 0.8479166666666668 | 0 |
| 0.8486111111111111 | 0 |
| 0.8493055555555555 | 0 |
| 0.85 | 0 |
| 0.8506944444444445 | 0 |
| 0.8513888888888889 | 0 |
| 0.8520833333333333 | 0 |
| 0.8527777777777777 | 0 |
| 0.8534722222222223 | 0 |
| 0.8541666666666666 | 0 |
| 0.8548611111111111 | 0 |
| 0.8555555555555556 | 0 |
| 0.8562500000000001 | 0 |
| 0.8569444444444444 | 0 |
| 0.8576388888888888 | 0 |
| 0.8583333333333334 | 0 |
| 0.8590277777777778 | 0 |
| 0.8597222222222222 | 0 |
| 0.8604166666666666 | 0 |
| 0.8611111111111112 | 0 |
| 0.8618055555555556 | 0 |
| 0.8624999999999999 | 0 |
| 0.8631944444444444 | 0 |
| 0.8638888888888889 | 0 |
| 0.8645833333333334 | 0 |
| 0.8652777777777777 | 0 |
| 0.8659722222222223 | 0 |
| 0.8666666666666667 | 0 |
| 0.8673611111111111 | 0 |
| 0.8680555555555555 | 0 |
| 0.86875 | 0 |
| 0.8694444444444445 | 0 |
| 0.8701388888888889 | 0 |
| 0.8708333333333332 | 0 |
| 0.8715277777777778 | 0 |
| 0.8722222222222222 | 0 |
| 0.8729166666666667 | 0 |
| 0.873611111111111 | 0 |
| 0.8743055555555556 | 0 |
| 0.875 | 0 |
| 0.8756944444444444 | 0 |
| 0.876388888888889 | 0 |
| 0.8770833333333333 | 0 |
| 0.8777777777777778 | 0 |
| 0.8784722222222222 | 0 |
| 0.8791666666666668 | 0 |
| 0.8798611111111111 | 0 |
| 0.8805555555555555 | 0 |
| 0.88125 | 0 |
| 0.8819444444444445 | 0 |
| 0.8826388888888889 | 0 |
| 0.8833333333333333 | 0 |
| 0.8840277777777777 | 0 |
| 0.8847222222222223 | 0 |
| 0.8854166666666666 | 0 |
| 0.8861111111111111 | 0 |
| 0.8868055555555556 | 0 |
| 0.8875000000000001 | 0 |
| 0.8881944444444444 | 0 |
| 0.8888888888888888 | 0 |
| 0.8895833333333334 | 0 |
| 0.8902777777777778 | 0 |
| 0.8909722222222222 | 0 |
| 0.8916666666666666 | 0 |
| 0.8923611111111112 | 0 |
| 0.8930555555555556 | 0 |
| 0.8937499999999999 | 0 |
| 0.8944444444444444 | 0 |
| 0.8951388888888889 | 0 |
| 0.8958333333333334 | 0 |
| 0.8965277777777777 | 0 |
| 0.8972222222222223 | 0 |
| 0.8979166666666667 | 0 |
| 0.8986111111111111 | 0 |
| 0.8993055555555555 | 0 |
| 0.9 | 0 |
| 0.9006944444444445 | 0 |
| 0.9013888888888889 | 0 |
| 0.9020833333333332 | 0 |
| 0.9027777777777778 | 0 |
| 0.9034722222222222 | 0 |
| 0.9041666666666667 | 0 |
| 0.904861111111111 | 0 |
| 0.9055555555555556 | 0 |
| 0.90625 | 0 |
| 0.9069444444444444 | 0 |
| 0.907638888888889 | 0 |
| 0.9083333333333333 | 0 |
| 0.9090277777777778 | 0 |
| 0.9097222222222222 | 0 |
| 0.9104166666666668 | 0 |
| 0.9111111111111111 | 0 |
| 0.9118055555555555 | 0 |
| 0.9125 | 0 |
| 0.9131944444444445 | 0 |
| 0.9138888888888889 | 0 |
| 0.9145833333333333 | 0 |
| 0.9152777777777777 | 0 |
| 0.9159722222222223 | 0 |
| 0.9166666666666666 | 0 |
| 0.9173611111111111 | 0 |
| 0.9180555555555556 | 0 |
| 0.9187500000000001 | 0 |
| 0.9194444444444444 | 0 |
| 0.9201388888888888 | 0 |
| 0.9208333333333334 | 0 |
| 0.9215277777777778 | 0 |
| 0.9222222222222222 | 0 |
| 0.9229166666666666 | 0 |
| 0.9236111111111112 | 0 |
| 0.9243055555555556 | 0 |
| 0.9249999999999999 | 0 |
| 0.9256944444444444 | 0 |
| 0.9263888888888889 | 0 |
| 0.9270833333333334 | 0 |
| 0.9277777777777777 | 0 |
| 0.9284722222222223 | 0 |
| 0.9291666666666667 | 0 |
| 0.9298611111111111 | 0 |
| 0.9305555555555555 | 0 |
| 0.93125 | 0 |
| 0.9319444444444445 | 0 |
| 0.9326388888888889 | 0 |
| 0.9333333333333332 | 0 |
| 0.9340277777777778 | 0 |
| 0.9347222222222222 | 0 |
| 0.9354166666666667 | 0 |
| 0.936111111111111 | 0 |
| 0.9368055555555556 | 0 |
| 0.9375 | 0 |
| 0.9381944444444444 | 0 |
| 0.938888888888889 | 0 |
| 0.9395833333333333 | 0 |
| 0.9402777777777778 | 0 |
| 0.9409722222222222 | 0 |
| 0.9416666666666668 | 0 |
| 0.9423611111111111 | 0 |
| 0.9430555555555555 | 0 |
| 0.94375 | 0 |
| 0.9444444444444445 | 0 |
| 0.9451388888888889 | 0 |
| 0.9458333333333333 | 0 |
| 0.9465277777777777 | 0 |
| 0.9472222222222223 | 0 |
| 0.9479166666666666 | 0 |
| 0.9486111111111111 | 0 |
| 0.9493055555555556 | 0 |
| 0.9500000000000001 | 0 |
| 0.9506944444444444 | 0 |
| 0.9513888888888888 | 0 |
| 0.9520833333333334 | 0 |
| 0.9527777777777778 | 0 |
| 0.9534722222222222 | 0 |
| 0.9541666666666666 | 0 |
| 0.9548611111111112 | 0 |
| 0.9555555555555556 | 0 |
| 0.9562499999999999 | 0 |
| 0.9569444444444444 | 0 |
| 0.9576388888888889 | 0 |
| 0.9583333333333334 | 0 |
| 0.9590277777777777 | 0 |
| 0.9597222222222223 | 0 |
| 0.9604166666666667 | 0 |
| 0.9611111111111111 | 0 |
| 0.9618055555555555 | 0 |
| 0.9625 | 0 |
| 0.9631944444444445 | 0 |
| 0.9638888888888889 | 0 |
| 0.9645833333333332 | 0 |
| 0.9652777777777778 | 0 |
| 0.9659722222222222 | 0 |
| 0.9666666666666667 | 0 |
| 0.967361111111111 | 0 |
| 0.9680555555555556 | 0 |
| 0.96875 | 0 |
| 0.9694444444444444 | 0 |
| 0.970138888888889 | 0 |
| 0.9708333333333333 | 0 |
| 0.9715277777777778 | 0 |
| 0.9722222222222222 | 0 |
| 0.9729166666666668 | 0 |
| 0.9736111111111111 | 0 |
| 0.9743055555555555 | 0 |
| 0.975 | 0 |
| 0.9756944444444445 | 0 |
| 0.9763888888888889 | 0 |
| 0.9770833333333333 | 0 |
| 0.9777777777777777 | 0 |
| 0.9784722222222223 | 0 |
| 0.9791666666666666 | 0 |
| 0.9798611111111111 | 0 |
| 0.9805555555555556 | 0 |
| 0.9812500000000001 | 0 |
| 0.9819444444444444 | 0 |
| 0.9826388888888888 | 0 |
| 0.9833333333333334 | 0 |
| 0.9840277777777778 | 0 |
| 0.9847222222222222 | 0 |
| 0.9854166666666666 | 0 |
| 0.9861111111111112 | 0 |
| 0.9868055555555556 | 0 |
| 0.9874999999999999 | 0 |
| 0.9881944444444444 | 0 |
| 0.9888888888888889 | 0 |
| 0.9895833333333334 | 0 |
| 0.9902777777777777 | 0 |
| 0.9909722222222223 | 0 |
| 0.9916666666666667 | 0 |
| 0.9923611111111111 | 0 |
| 0.9930555555555555 | 0 |
| 0.99375 | 0 |
| 0.9944444444444445 | 0 |
| 0.9951388888888889 | 0 |
| 0.9958333333333332 | 0 |
| 0.9965277777777778 | 0 |
| 0.9972222222222222 | 0 |
| 0.9979166666666667 | 0 |
| 0.998611111111111 | 0 |
| 0.9993055555555556 | 0 |